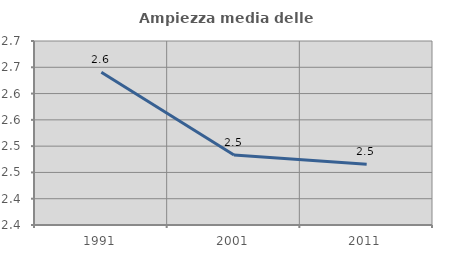
| Category | Ampiezza media delle famiglie |
|---|---|
| 1991.0 | 2.641 |
| 2001.0 | 2.483 |
| 2011.0 | 2.465 |